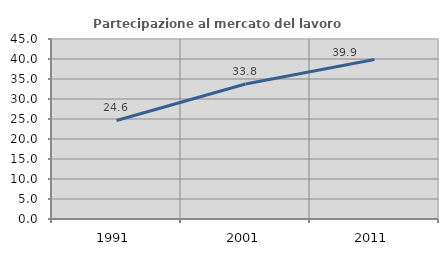
| Category | Partecipazione al mercato del lavoro  femminile |
|---|---|
| 1991.0 | 24.638 |
| 2001.0 | 33.76 |
| 2011.0 | 39.896 |